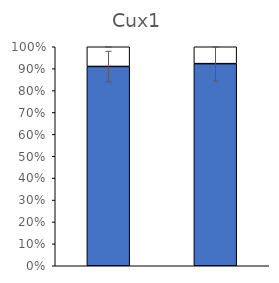
| Category | Series 0 | Series 1 |
|---|---|---|
| 0 | 91.006 | 8.994 |
| 1 | 92.288 | 7.712 |